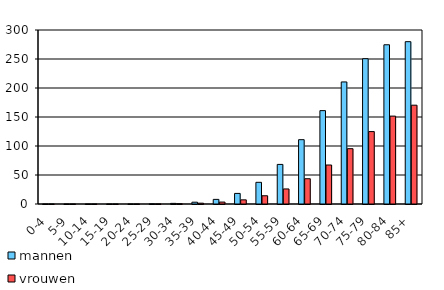
| Category | mannen | vrouwen |
|---|---|---|
| 0-4 | 0 | 0 |
| 5-9 | 0.001 | 0.002 |
| 10-14 | 0.006 | 0.006 |
| 15-19 | 0.026 | 0.022 |
| 20-24 | 0.1 | 0.07 |
| 25-29 | 0.35 | 0.206 |
| 30-34 | 1.101 | 0.564 |
| 35-39 | 3.122 | 1.425 |
| 40-44 | 7.966 | 3.324 |
| 45-49 | 18.247 | 7.158 |
| 50-54 | 37.38 | 14.208 |
| 55-59 | 68.243 | 25.955 |
| 60-64 | 110.906 | 43.579 |
| 65-69 | 160.983 | 67.222 |
| 70-74 | 210.439 | 95.376 |
| 75-79 | 250.528 | 124.859 |
| 80-84 | 274.525 | 151.519 |
| 85+ | 279.854 | 170.352 |